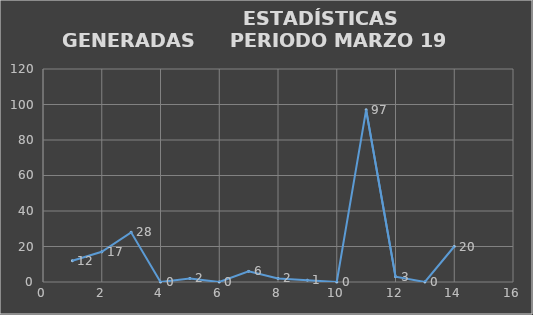
| Category |                   ESTADÍSTICAS GENERADAS     PERIODO MARZO 19 CANTIDAD |
|---|---|
| 0 | 12 |
| 1 | 17 |
| 2 | 28 |
| 3 | 0 |
| 4 | 2 |
| 5 | 0 |
| 6 | 6 |
| 7 | 2 |
| 8 | 1 |
| 9 | 0 |
| 10 | 97 |
| 11 | 3 |
| 12 | 0 |
| 13 | 20 |